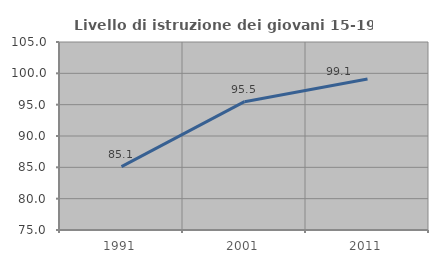
| Category | Livello di istruzione dei giovani 15-19 anni |
|---|---|
| 1991.0 | 85.116 |
| 2001.0 | 95.479 |
| 2011.0 | 99.096 |